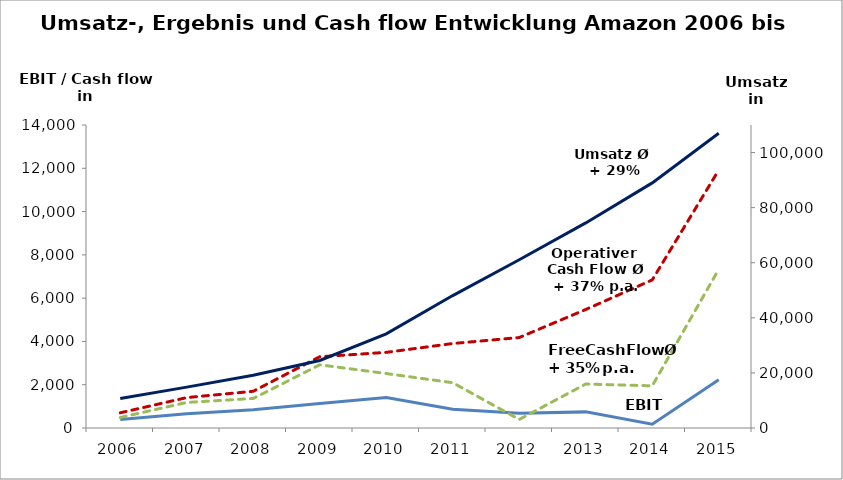
| Category | Operatives Ergebnis | Operativer Cash flow | Free Cash Flow |
|---|---|---|---|
| 2006.0 | 389 | 702 | 486 |
| 2007.0 | 655 | 1405 | 1181 |
| 2008.0 | 842 | 1697 | 1364 |
| 2009.0 | 1129 | 3293 | 2920 |
| 2010.0 | 1406 | 3495 | 2516 |
| 2011.0 | 862 | 3903 | 2092 |
| 2012.0 | 676 | 4180 | 395 |
| 2013.0 | 745 | 5475 | 2031 |
| 2014.0 | 178 | 6842 | 1949 |
| 2015.0 | 2233 | 11920 | 7331 |